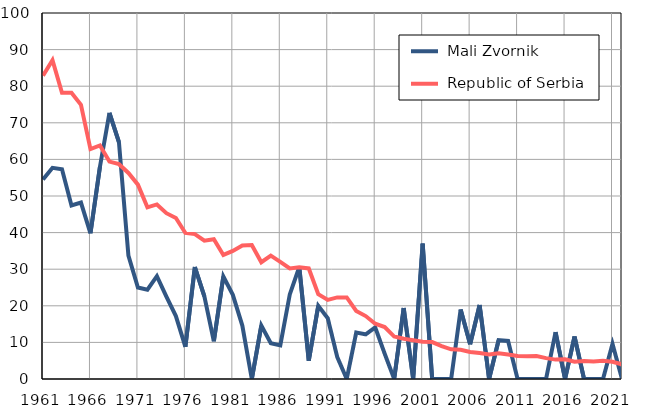
| Category |  Mali Zvornik |  Republic of Serbia |
|---|---|---|
| 1961.0 | 54.5 | 82.9 |
| 1962.0 | 57.7 | 87.1 |
| 1963.0 | 57.3 | 78.2 |
| 1964.0 | 47.4 | 78.2 |
| 1965.0 | 48.2 | 74.9 |
| 1966.0 | 39.8 | 62.8 |
| 1967.0 | 58 | 63.8 |
| 1968.0 | 72.7 | 59.4 |
| 1969.0 | 64.7 | 58.7 |
| 1970.0 | 33.7 | 56.3 |
| 1971.0 | 25 | 53.1 |
| 1972.0 | 24.4 | 46.9 |
| 1973.0 | 28.1 | 47.7 |
| 1974.0 | 22.5 | 45.3 |
| 1975.0 | 17.2 | 44 |
| 1976.0 | 8.8 | 39.9 |
| 1977.0 | 30.6 | 39.6 |
| 1978.0 | 22.6 | 37.8 |
| 1979.0 | 10.3 | 38.2 |
| 1980.0 | 28 | 33.9 |
| 1981.0 | 23 | 35 |
| 1982.0 | 14.6 | 36.5 |
| 1983.0 | 0 | 36.6 |
| 1984.0 | 14.6 | 31.9 |
| 1985.0 | 9.8 | 33.7 |
| 1986.0 | 9.2 | 32 |
| 1987.0 | 23.1 | 30.2 |
| 1988.0 | 30.6 | 30.5 |
| 1989.0 | 5 | 30.2 |
| 1990.0 | 20 | 23.2 |
| 1991.0 | 16.6 | 21.6 |
| 1992.0 | 6 | 22.3 |
| 1993.0 | 0 | 22.3 |
| 1994.0 | 12.7 | 18.6 |
| 1995.0 | 12.2 | 17.2 |
| 1996.0 | 14.1 | 15.1 |
| 1997.0 | 6.9 | 14.2 |
| 1998.0 | 0 | 11.6 |
| 1999.0 | 19.4 | 11 |
| 2000.0 | 0 | 10.6 |
| 2001.0 | 37 | 10.2 |
| 2002.0 | 0 | 10.1 |
| 2003.0 | 0 | 9 |
| 2004.0 | 0 | 8.1 |
| 2005.0 | 19 | 8 |
| 2006.0 | 9.5 | 7.4 |
| 2007.0 | 20.2 | 7.1 |
| 2008.0 | 0 | 6.7 |
| 2009.0 | 10.6 | 7 |
| 2010.0 | 10.4 | 6.7 |
| 2011.0 | 0 | 6.3 |
| 2012.0 | 0 | 6.2 |
| 2013.0 | 0 | 6.3 |
| 2014.0 | 0 | 5.7 |
| 2015.0 | 12.8 | 5.3 |
| 2016.0 | 0 | 5.4 |
| 2017.0 | 11.6 | 4.7 |
| 2018.0 | 0 | 4.9 |
| 2019.0 | 0 | 4.8 |
| 2020.0 | 0 | 5 |
| 2021.0 | 9.6 | 4.7 |
| 2022.0 | 0 | 4 |